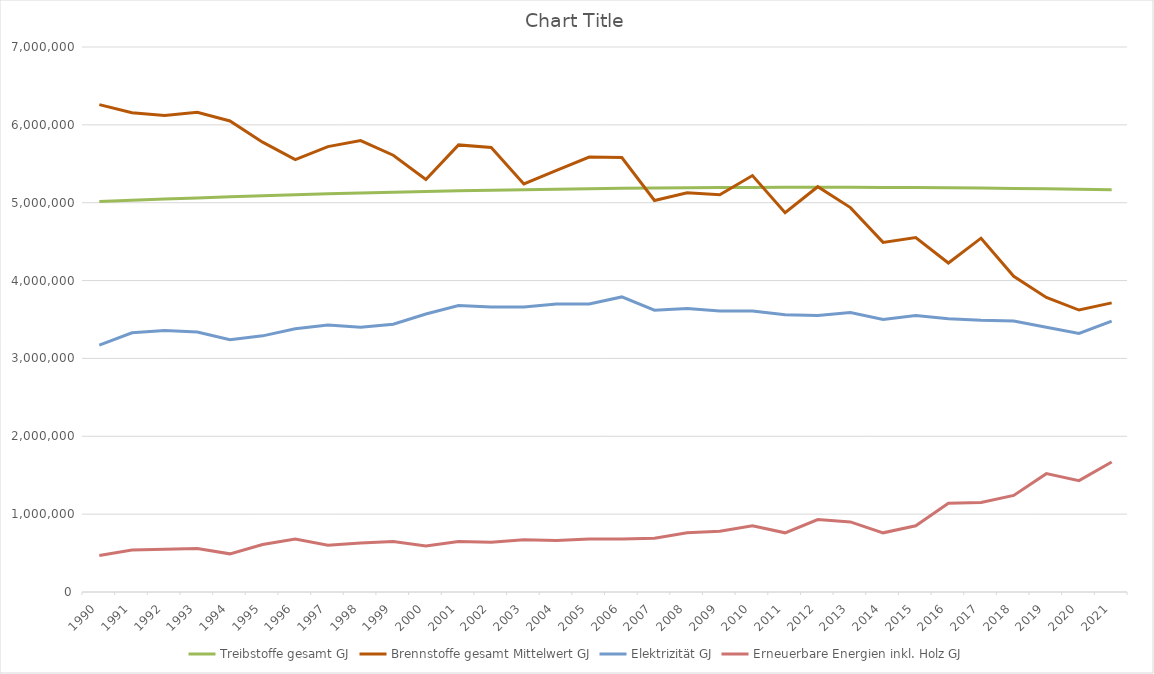
| Category | Treibstoffe gesamt | max. | min. | Brennstoffe gesamt max. | Brennstoffe gesamt min. | Brennstoffe gesamt Mittelwert | Elektrizität | Erneuerbare Energien inkl. Holz | Direkte Energie gesamt max. | Direkte Energie gesamt min. |
|---|---|---|---|---|---|---|---|---|---|---|
| 1990.0 | 5015253.014 |  |  |  |  | 6259835.922 | 3170000 | 470000 |  |  |
| 1991.0 | 5031624.895 |  |  |  |  | 6155042.752 | 3330000 | 540000 |  |  |
| 1992.0 | 5047222.469 |  |  |  |  | 6119944.542 | 3360000 | 550000 |  |  |
| 1993.0 | 5062046.513 |  |  |  |  | 6161872.301 | 3340000 | 560000 |  |  |
| 1994.0 | 5076097.805 |  |  |  |  | 6049708.78 | 3240000 | 490000 |  |  |
| 1995.0 | 5089377.118 |  |  |  |  | 5777545.26 | 3290000 | 610000 |  |  |
| 1996.0 | 5101885.227 |  |  |  |  | 5552813.9 | 3380000 | 680000 |  |  |
| 1997.0 | 5113622.904 |  |  |  |  | 5720755.579 | 3430000 | 600000 |  |  |
| 1998.0 | 5124590.92 |  |  |  |  | 5798697.258 | 3400000 | 630000 |  |  |
| 1999.0 | 5134790.046 |  |  |  |  | 5609765.255 | 3440000 | 650000 |  |  |
| 2000.0 | 5144221.05 |  |  |  |  | 5297585.529 | 3570000 | 590000 |  |  |
| 2001.0 | 5152884.702 |  |  |  |  | 5742353.481 | 3680000 | 650000 |  |  |
| 2002.0 | 5160781.766 |  |  |  |  | 5710152.587 | 3660000 | 640000 |  |  |
| 2003.0 | 5167913.01 |  |  |  |  | 5240681.762 | 3660000 | 670000 |  |  |
| 2004.0 | 5174279.197 |  |  |  |  | 5416105.145 | 3700000 | 660000 |  |  |
| 2005.0 | 5179881.091 |  |  |  |  | 5587135.723 | 3700000 | 680000 |  |  |
| 2006.0 | 5184719.455 |  |  |  |  | 5579349.412 | 3790000 | 680000 |  |  |
| 2007.0 | 5188795.048 |  |  |  |  | 5029153.264 | 3620000 | 690000 |  |  |
| 2008.0 | 5192108.631 |  |  |  |  | 5128654.988 | 3640000 | 760000 |  |  |
| 2009.0 | 5194660.964 |  |  |  |  | 5103265.627 | 3610000 | 780000 |  |  |
| 2010.0 | 5196452.802 |  |  |  |  | 5348597.184 | 3610000 | 850000 |  |  |
| 2011.0 | 5197484.904 |  |  |  |  | 4871067.295 | 3560000 | 760000 |  |  |
| 2012.0 | 5197758.024 |  |  |  |  | 5205630.595 | 3550000 | 930000 |  |  |
| 2013.0 | 5197272.917 |  |  |  |  | 4937136.607 | 3590000 | 900000 |  |  |
| 2014.0 | 5196030.336 |  |  |  |  | 4490645.479 | 3500000 | 760000 |  |  |
| 2015.0 | 5194031.033 |  |  |  |  | 4552844.38 | 3550000 | 850000 |  |  |
| 2016.0 | 5191275.758 |  |  |  |  | 4225507.213 | 3510000 | 1140000 |  |  |
| 2017.0 | 5187765.262 |  |  |  |  | 4544478.848 | 3490000 | 1150000 |  |  |
| 2018.0 | 5183500.293 |  |  |  |  | 4055271.885 | 3480000 | 1240000 |  |  |
| 2019.0 | 5178481.598 |  |  |  |  | 3783852.286 | 3400000 | 1520000 |  |  |
| 2020.0 | 5172709.925 |  |  |  |  | 3621384.166 | 3320000 | 1430000 |  |  |
| 2021.0 | 5166186.019 |  |  |  |  | 3713234.098 | 3480000 | 1670000 |  |  |